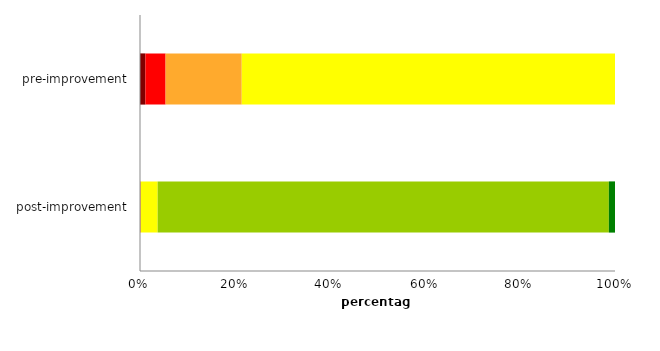
| Category | G | F | E | D | C | A/B |
|---|---|---|---|---|---|---|
| post-improvement | 0 | 0.026 | 0.18 | 3.511 | 94.989 | 1.293 |
| pre-improvement | 1.127 | 4.258 | 16.036 | 78.579 | 0 | 0 |